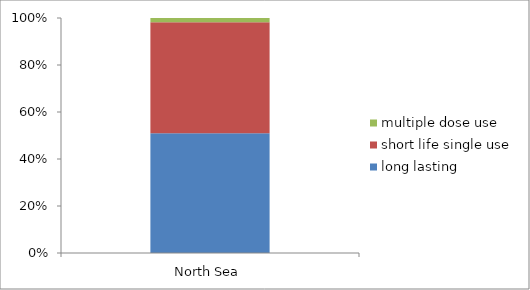
| Category | long lasting | short life single use | multiple dose use |
|---|---|---|---|
| North Sea | 45014 | 41664 | 1569 |